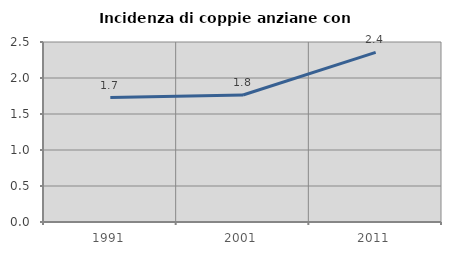
| Category | Incidenza di coppie anziane con figli |
|---|---|
| 1991.0 | 1.727 |
| 2001.0 | 1.763 |
| 2011.0 | 2.357 |